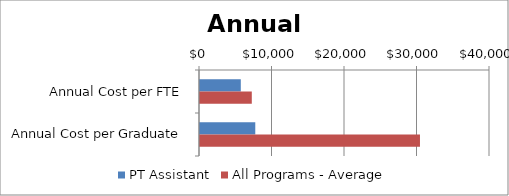
| Category | PT Assistant | All Programs - Average |
|---|---|---|
| Annual Cost per FTE | 5627.212 | 7144 |
| Annual Cost per Graduate | 7624.872 | 30340 |